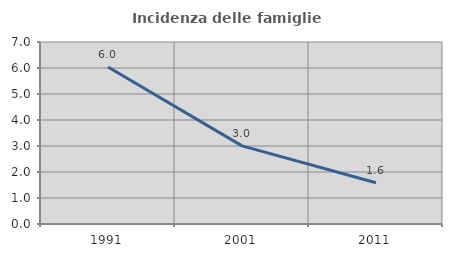
| Category | Incidenza delle famiglie numerose |
|---|---|
| 1991.0 | 6.041 |
| 2001.0 | 3.006 |
| 2011.0 | 1.587 |